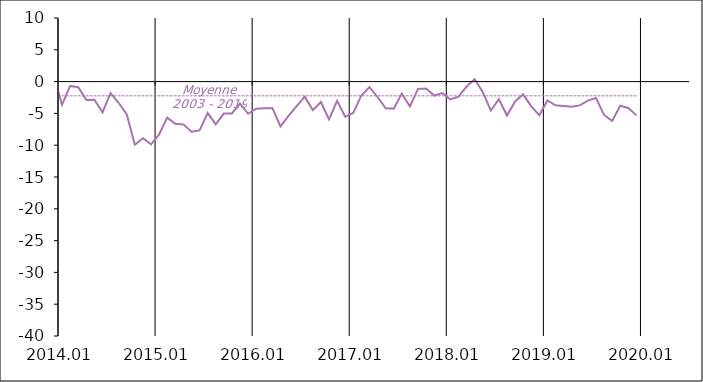
| Category | Series 1 | Moyenne
2003 - 2019 |
|---|---|---|
| 2003-01-20 | 3 | -2.237 |
| 2003-02-20 | 1 | -2.237 |
| 2003-03-20 | 0 | -2.237 |
| 2003-04-20 | 3 | -2.237 |
| 2003-05-20 | 4 | -2.237 |
| 2003-06-20 | 2 | -2.237 |
| 2003-07-20 | 3 | -2.237 |
| 2003-08-20 | 2 | -2.237 |
| 2003-09-20 | 2 | -2.237 |
| 2003-10-20 | 4 | -2.237 |
| 2003-11-20 | 4 | -2.237 |
| 2003-12-20 | 3 | -2.237 |
| 2004-01-20 | 4 | -2.237 |
| 2004-02-20 | 6 | -2.237 |
| 2004-03-20 | 3 | -2.237 |
| 2004-04-20 | 4 | -2.237 |
| 2004-05-20 | 3 | -2.237 |
| 2004-06-20 | 6 | -2.237 |
| 2004-07-20 | 3 | -2.237 |
| 2004-08-20 | 5 | -2.237 |
| 2004-09-20 | 4 | -2.237 |
| 2004-10-20 | 4 | -2.237 |
| 2004-11-20 | 2 | -2.237 |
| 2004-12-20 | 4 | -2.237 |
| 2005-01-20 | 2 | -2.237 |
| 2005-02-20 | 3 | -2.237 |
| 2005-03-20 | 4 | -2.237 |
| 2005-04-20 | 1 | -2.237 |
| 2005-05-20 | 2 | -2.237 |
| 2005-06-20 | 2 | -2.237 |
| 2005-07-20 | 2 | -2.237 |
| 2005-08-20 | -1 | -2.237 |
| 2005-09-20 | -4 | -2.237 |
| 2005-10-20 | -1 | -2.237 |
| 2005-11-20 | 1 | -2.237 |
| 2005-12-20 | 4 | -2.237 |
| 2006-01-20 | 3 | -2.237 |
| 2006-02-20 | 2 | -2.237 |
| 2006-03-20 | 5 | -2.237 |
| 2006-04-20 | 3 | -2.237 |
| 2006-05-20 | 1 | -2.237 |
| 2006-06-20 | 4 | -2.237 |
| 2006-07-20 | 2 | -2.237 |
| 2006-08-20 | 2 | -2.237 |
| 2006-09-20 | 0 | -2.237 |
| 2006-10-20 | 4 | -2.237 |
| 2006-11-20 | 6 | -2.237 |
| 2006-12-20 | 2 | -2.237 |
| 2007-01-20 | 4 | -2.237 |
| 2007-02-20 | 5 | -2.237 |
| 2007-03-20 | 3 | -2.237 |
| 2007-04-20 | 3 | -2.237 |
| 2007-05-20 | 3 | -2.237 |
| 2007-06-20 | 3 | -2.237 |
| 2007-07-20 | 3 | -2.237 |
| 2007-08-20 | 2 | -2.237 |
| 2007-09-20 | 6 | -2.237 |
| 2007-10-20 | 0 | -2.237 |
| 2007-11-20 | -4 | -2.237 |
| 2007-12-20 | -3 | -2.237 |
| 2008-01-20 | -5 | -2.237 |
| 2008-02-20 | -6 | -2.237 |
| 2008-03-20 | -5 | -2.237 |
| 2008-04-20 | -5 | -2.237 |
| 2008-05-20 | -4 | -2.237 |
| 2008-06-20 | -8 | -2.237 |
| 2008-07-20 | -5 | -2.237 |
| 2008-08-20 | -2 | -2.237 |
| 2008-09-20 | -2 | -2.237 |
| 2008-10-20 | -6 | -2.237 |
| 2008-11-20 | -7 | -2.237 |
| 2008-12-20 | -5 | -2.237 |
| 2009-01-20 | -3 | -2.237 |
| 2009-02-20 | -5 | -2.237 |
| 2009-03-20 | -4 | -2.237 |
| 2009-04-20 | -5 | -2.237 |
| 2009-05-20 | -1 | -2.237 |
| 2009-06-20 | -1 | -2.237 |
| 2009-07-20 | -3 | -2.237 |
| 2009-08-20 | -3 | -2.237 |
| 2009-09-20 | -2 | -2.237 |
| 2009-10-20 | -1 | -2.237 |
| 2009-11-20 | 0 | -2.237 |
| 2009-12-20 | -2 | -2.237 |
| 2010-01-20 | -3 | -2.237 |
| 2010-02-20 | -2 | -2.237 |
| 2010-03-20 | 0 | -2.237 |
| 2010-04-20 | 0 | -2.237 |
| 2010-05-20 | -5 | -2.237 |
| 2010-06-20 | 0 | -2.237 |
| 2010-07-20 | -1 | -2.237 |
| 2010-08-20 | -2 | -2.237 |
| 2010-09-20 | 1 | -2.237 |
| 2010-10-20 | -1 | -2.237 |
| 2010-11-20 | 1 | -2.237 |
| 2010-12-20 | -4 | -2.237 |
| 2011-01-20 | -4 | -2.237 |
| 2011-02-20 | -1 | -2.237 |
| 2011-03-20 | -5 | -2.237 |
| 2011-04-20 | -3 | -2.237 |
| 2011-05-20 | -1 | -2.237 |
| 2011-06-20 | -5 | -2.237 |
| 2011-07-20 | -3 | -2.237 |
| 2011-08-20 | -2 | -2.237 |
| 2011-09-20 | -1 | -2.237 |
| 2011-10-20 | -4 | -2.237 |
| 2011-11-20 | -6 | -2.237 |
| 2011-12-20 | -7 | -2.237 |
| 2012-01-20 | -11 | -2.237 |
| 2012-02-20 | -8 | -2.237 |
| 2012-03-20 | -9 | -2.237 |
| 2012-04-20 | -6 | -2.237 |
| 2012-05-20 | -7 | -2.237 |
| 2012-06-20 | -6 | -2.237 |
| 2012-07-20 | -3 | -2.237 |
| 2012-08-20 | -7 | -2.237 |
| 2012-09-20 | -8 | -2.237 |
| 2012-10-20 | -6 | -2.237 |
| 2012-11-20 | -11.159 | -2.237 |
| 2012-12-20 | -12.019 | -2.237 |
| 2013-01-20 | -8.027 | -2.237 |
| 2013-02-20 | -6.036 | -2.237 |
| 2013-03-20 | -7.944 | -2.237 |
| 2013-04-20 | -8.796 | -2.237 |
| 2013-05-20 | -5.46 | -2.237 |
| 2013-06-20 | -9.135 | -2.237 |
| 2013-07-20 | -11.295 | -2.237 |
| 2013-08-20 | -9.198 | -2.237 |
| 2013-09-20 | -2.654 | -2.237 |
| 2013-10-20 | -2.408 | -2.237 |
| 2013-11-20 | -2.171 | -2.237 |
| 2013-12-20 | 0.8 | -2.237 |
| 2014-01-20 | -3.651 | -2.237 |
| 2014-02-20 | -0.688 | -2.237 |
| 2014-03-20 | -0.891 | -2.237 |
| 2014-04-20 | -2.876 | -2.237 |
| 2014-05-20 | -2.85 | -2.237 |
| 2014-06-20 | -4.825 | -2.237 |
| 2014-07-20 | -1.82 | -2.237 |
| 2014-08-20 | -3.325 | -2.237 |
| 2014-09-20 | -5.147 | -2.237 |
| 2014-10-20 | -9.93 | -2.237 |
| 2014-11-20 | -8.903 | -2.237 |
| 2014-12-20 | -9.87 | -2.237 |
| 2015-01-20 | -8.304 | -2.237 |
| 2015-02-20 | -5.658 | -2.237 |
| 2015-03-20 | -6.634 | -2.237 |
| 2015-04-20 | -6.726 | -2.237 |
| 2015-05-20 | -7.878 | -2.237 |
| 2015-06-20 | -7.678 | -2.237 |
| 2015-07-20 | -4.95 | -2.237 |
| 2015-08-20 | -6.732 | -2.237 |
| 2015-09-20 | -5.021 | -2.237 |
| 2015-10-20 | -5.014 | -2.237 |
| 2015-11-20 | -3.473 | -2.237 |
| 2015-12-20 | -5.063 | -2.237 |
| 2016-01-20 | -4.253 | -2.237 |
| 2016-02-20 | -4.198 | -2.237 |
| 2016-03-20 | -4.14 | -2.237 |
| 2016-04-20 | -7.054 | -2.237 |
| 2016-05-20 | -5.4 | -2.237 |
| 2016-06-20 | -3.867 | -2.237 |
| 2016-07-20 | -2.375 | -2.237 |
| 2016-08-20 | -4.479 | -2.237 |
| 2016-09-20 | -3.209 | -2.237 |
| 2016-10-20 | -5.945 | -2.237 |
| 2016-11-20 | -3.017 | -2.237 |
| 2016-12-20 | -5.534 | -2.237 |
| 2017-01-20 | -4.932 | -2.237 |
| 2017-02-20 | -2.179 | -2.237 |
| 2017-03-20 | -0.852 | -2.237 |
| 2017-04-20 | -2.419 | -2.237 |
| 2017-05-20 | -4.188 | -2.237 |
| 2017-06-20 | -4.249 | -2.237 |
| 2017-07-20 | -1.891 | -2.237 |
| 2017-08-20 | -3.891 | -2.237 |
| 2017-09-20 | -1.141 | -2.237 |
| 2017-10-20 | -1.086 | -2.237 |
| 2017-11-20 | -2.199 | -2.237 |
| 2017-12-20 | -1.794 | -2.237 |
| 2018-01-20 | -2.804 | -2.237 |
| 2018-02-20 | -2.357 | -2.237 |
| 2018-03-20 | -0.788 | -2.237 |
| 2018-04-20 | 0.398 | -2.237 |
| 2018-05-20 | -1.623 | -2.237 |
| 2018-06-20 | -4.546 | -2.237 |
| 2018-07-20 | -2.769 | -2.237 |
| 2018-08-20 | -5.337 | -2.237 |
| 2018-09-20 | -3.129 | -2.237 |
| 2018-10-20 | -2.002 | -2.237 |
| 2018-11-20 | -3.89 | -2.237 |
| 2018-12-20 | -5.29 | -2.237 |
| 2019-01-20 | -2.96 | -2.237 |
| 2019-02-20 | -3.73 | -2.237 |
| 2019-03-20 | -3.82 | -2.237 |
| 2019-04-20 | -3.954 | -2.237 |
| 2019-05-20 | -3.74 | -2.237 |
| 2019-06-20 | -2.98 | -2.237 |
| 2019-07-20 | -2.59 | -2.237 |
| 2019-08-20 | -5.23 | -2.237 |
| 2019-09-20 | -6.2 | -2.237 |
| 2019-10-20 | -3.79 | -2.237 |
| 2019-11-20 | -4.14 | -2.237 |
| 2019-12-20 | -5.31 | -2.237 |